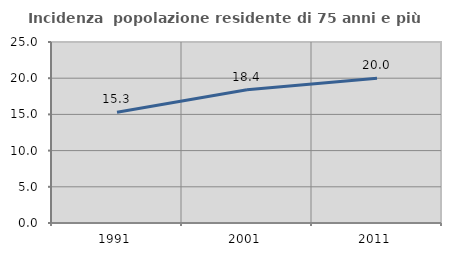
| Category | Incidenza  popolazione residente di 75 anni e più |
|---|---|
| 1991.0 | 15.284 |
| 2001.0 | 18.394 |
| 2011.0 | 20 |